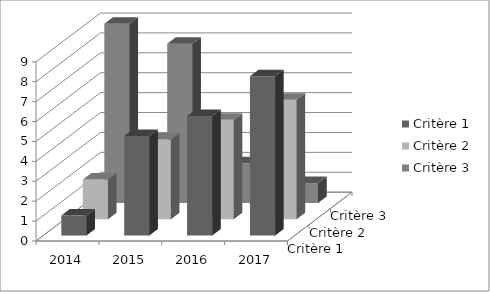
| Category | Critère 1 | Critère 2 | Critère 3 |
|---|---|---|---|
| 2014.0 | 1 | 2 | 9 |
| 2015.0 | 5 | 4 | 8 |
| 2016.0 | 6 | 5 | 2 |
| 2017.0 | 8 | 6 | 1 |